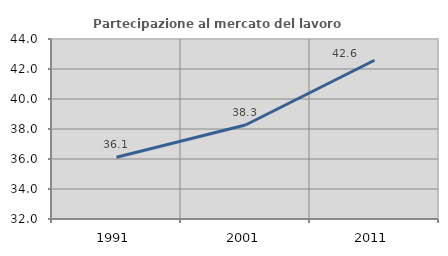
| Category | Partecipazione al mercato del lavoro  femminile |
|---|---|
| 1991.0 | 36.114 |
| 2001.0 | 38.266 |
| 2011.0 | 42.581 |